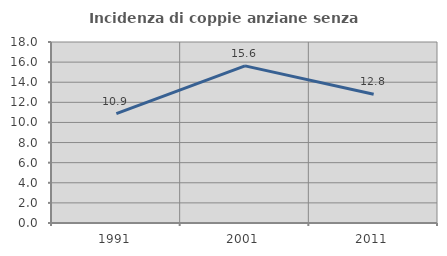
| Category | Incidenza di coppie anziane senza figli  |
|---|---|
| 1991.0 | 10.87 |
| 2001.0 | 15.625 |
| 2011.0 | 12.808 |